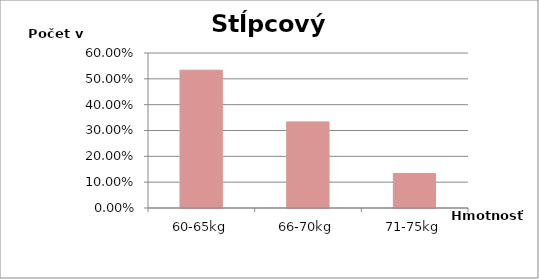
| Category | počet v % |
|---|---|
| 60-65kg | 0.533 |
| 66-70kg | 0.333 |
| 71-75kg | 0.133 |